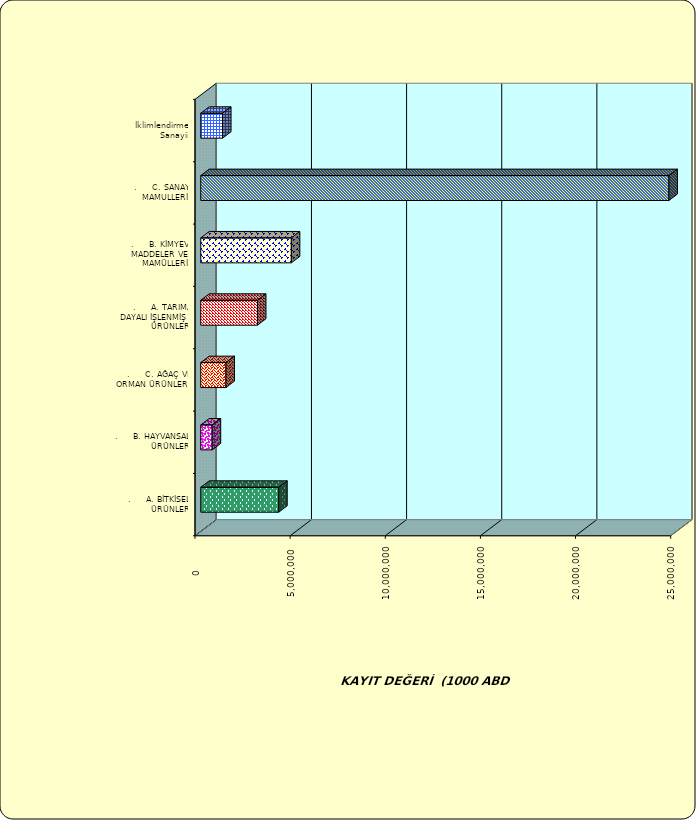
| Category | Series 0 |
|---|---|
| .     A. BİTKİSEL ÜRÜNLER | 4097698.079 |
| .     B. HAYVANSAL ÜRÜNLER | 601962.785 |
| .     C. AĞAÇ VE ORMAN ÜRÜNLERİ | 1326098.635 |
| .     A. TARIMA DAYALI İŞLENMİŞ ÜRÜNLER | 2980376.684 |
| .     B. KİMYEVİ MADDELER VE MAMÜLLERİ | 4761331.669 |
| .     C. SANAYİ MAMULLERİ | 24606211.414 |
|  İklimlendirme Sanayii | 1145592.415 |